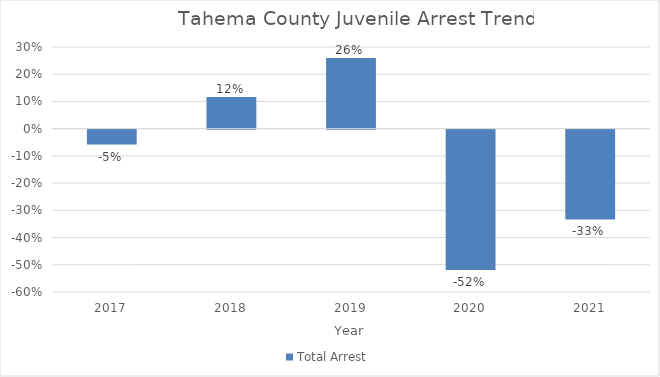
| Category | Total Arrest |
|---|---|
| 2017.0 | -0.055 |
| 2018.0 | 0.116 |
| 2019.0 | 0.26 |
| 2020.0 | -0.515 |
| 2021.0 | -0.33 |